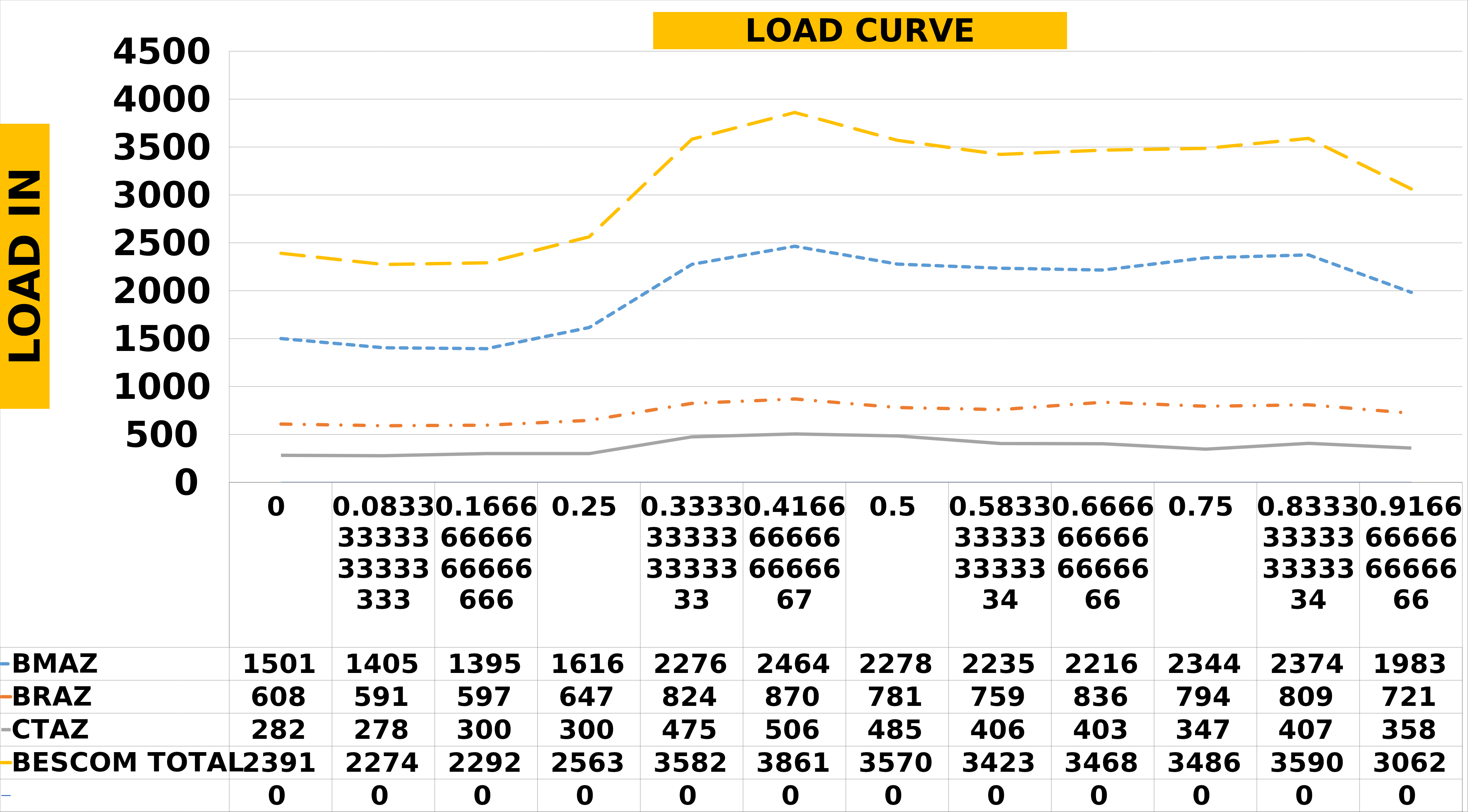
| Category | BMAZ | BRAZ | CTAZ | BESCOM TOTAL | Series 4 |
|---|---|---|---|---|---|
| 0.0 | 1501 | 608.3 | 281.7 | 2391 |  |
| 0.08333333333333333 | 1405 | 591 | 277.8 | 2273.8 |  |
| 0.16666666666666666 | 1395 | 596.5 | 300.1 | 2291.6 |  |
| 0.25 | 1616 | 647 | 300 | 2563 |  |
| 0.3333333333333333 | 2276 | 824.4 | 475.2 | 3581.6 |  |
| 0.4166666666666667 | 2464 | 870.2 | 505.5 | 3860.7 |  |
| 0.5 | 2278 | 780.9 | 484.7 | 3569.6 |  |
| 0.5833333333333334 | 2235 | 759 | 405.6 | 3422.6 |  |
| 0.6666666666666666 | 2216 | 836.3 | 402.8 | 3468.1 |  |
| 0.75 | 2344 | 794.3 | 346.8 | 3486.1 |  |
| 0.8333333333333334 | 2374 | 809.3 | 406.8 | 3590.1 |  |
| 0.9166666666666666 | 1983 | 721.4 | 357.9 | 3062.3 |  |